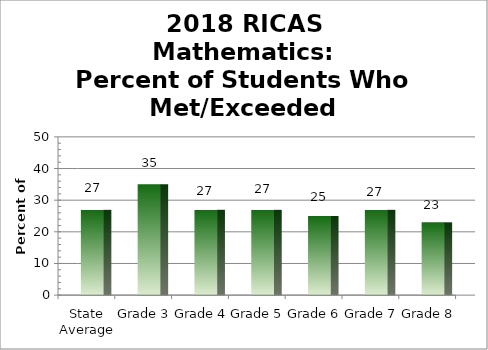
| Category | Levels 3 & 4 |
|---|---|
| State Average | 27 |
| Grade 3 | 35 |
| Grade 4 | 27 |
| Grade 5 | 27 |
| Grade 6 | 25 |
| Grade 7 | 27 |
| Grade 8 | 23 |